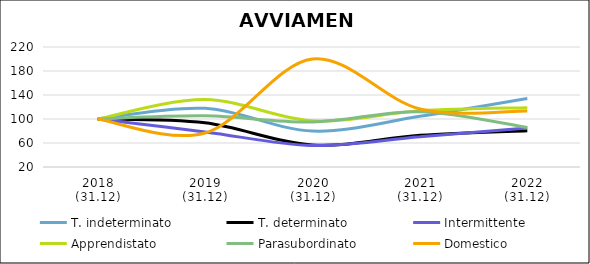
| Category | T. indeterminato | T. determinato | Intermittente | Apprendistato | Parasubordinato | Domestico |
|---|---|---|---|---|---|---|
| 2018
(31.12) | 100 | 100 | 100 | 100 | 100 | 100 |
| 2019
(31.12) | 117.726 | 93.58 | 78.446 | 132.474 | 105.224 | 76.667 |
| 2020
(31.12) | 79.933 | 56.569 | 55.855 | 97.079 | 95.025 | 200 |
| 2021
(31.12) | 104.404 | 72.734 | 70.363 | 113.574 | 112.189 | 116.667 |
| 2022
(31.12) | 134.058 | 80.572 | 85.181 | 118.9 | 85.821 | 113.333 |